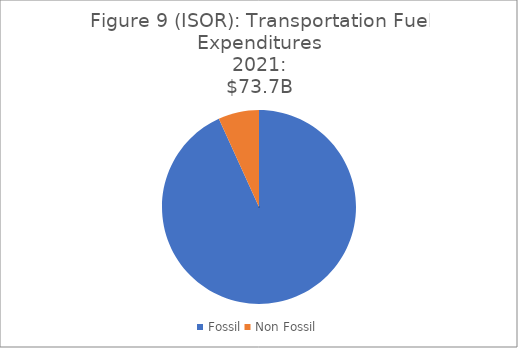
| Category | 2021 |
|---|---|
| Fossil | 68718010006.107 |
| Non Fossil | 5008714232.594 |